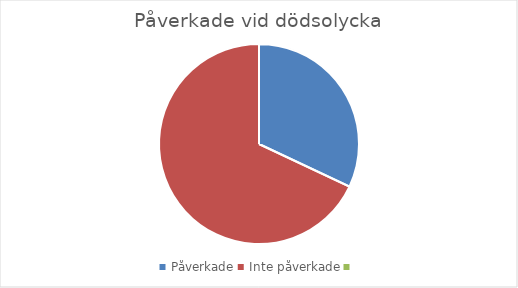
| Category | Antal |
|---|---|
| Påverkade | 32 |
| Inte påverkade | 68 |